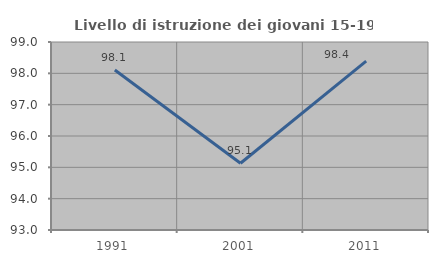
| Category | Livello di istruzione dei giovani 15-19 anni |
|---|---|
| 1991.0 | 98.107 |
| 2001.0 | 95.131 |
| 2011.0 | 98.392 |